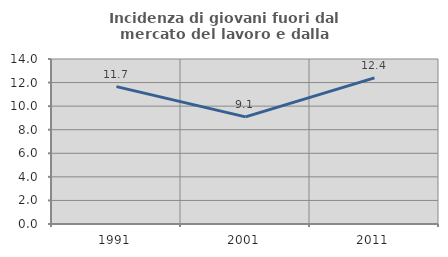
| Category | Incidenza di giovani fuori dal mercato del lavoro e dalla formazione  |
|---|---|
| 1991.0 | 11.656 |
| 2001.0 | 9.091 |
| 2011.0 | 12.4 |